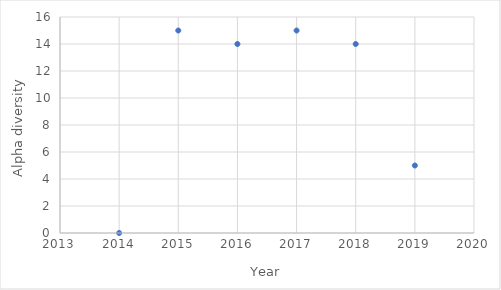
| Category | Alpha |
|---|---|
| 2014.0 | 0 |
| 2015.0 | 15 |
| 2016.0 | 14 |
| 2017.0 | 15 |
| 2018.0 | 14 |
| 2019.0 | 5 |